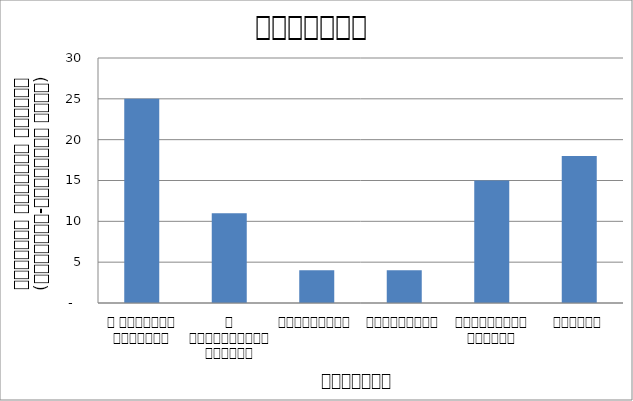
| Category | राजनीति |
|---|---|
| द हिमालयन टाइम्स् | 25 |
| द काठमाण्डौं पोस्ट् | 11 |
| रिपब्लिका | 4 |
| कान्तिपुर | 4 |
| अन्नपूर्ण पोस्ट् | 15 |
| नागरिक | 18 |